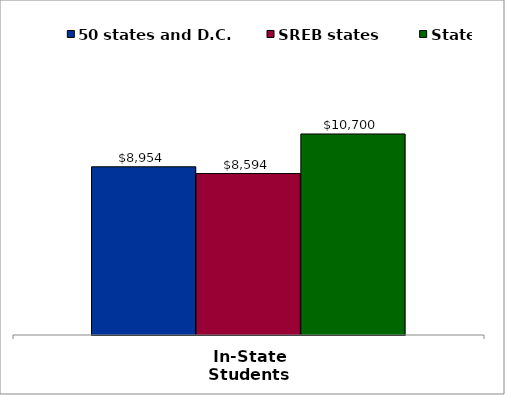
| Category | 50 states and D.C. | SREB states | State |
|---|---|---|---|
| In-State Students | 8953.5 | 8594 | 10700 |